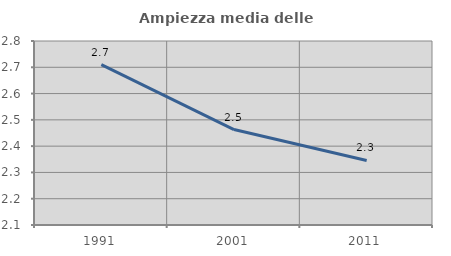
| Category | Ampiezza media delle famiglie |
|---|---|
| 1991.0 | 2.71 |
| 2001.0 | 2.463 |
| 2011.0 | 2.346 |